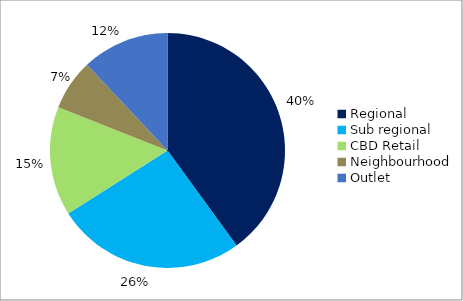
| Category | Series 0 |
|---|---|
| Regional | 0.4 |
| Sub regional | 0.26 |
| CBD Retail | 0.15 |
| Neighbourhood | 0.07 |
| Outlet | 0.12 |